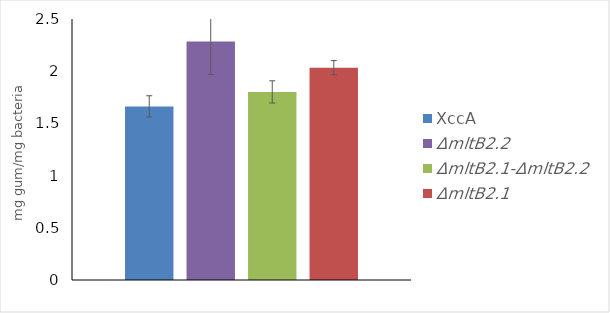
| Category | XccA | ΔmltB2.2 | ΔmltB2.1-ΔmltB2.2 | ΔmltB2.1 |
|---|---|---|---|---|
| 0 | 1.663 | 2.285 | 1.801 | 2.034 |